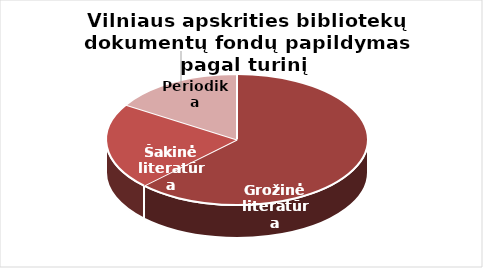
| Category | Series 0 |
|---|---|
| Grožinė literatūra | 82785 |
| Šakinė literatūra | 28260 |
| Periodika | 21283 |